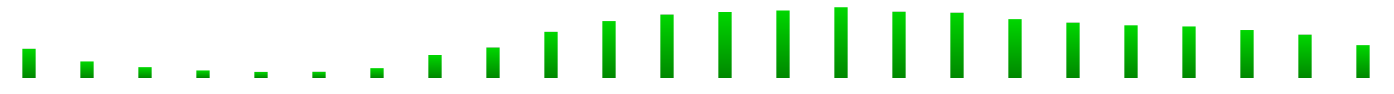
| Category | Series 0 |
|---|---|
| 0 | 299353 |
| 1 | 169805 |
| 2 | 111224 |
| 3 | 77540 |
| 4 | 62429 |
| 5 | 63512 |
| 6 | 100918 |
| 7 | 235971 |
| 8 | 312132 |
| 9 | 473377 |
| 10 | 583693 |
| 11 | 650069 |
| 12 | 677840 |
| 13 | 693407 |
| 14 | 726834 |
| 15 | 680317 |
| 16 | 667971 |
| 17 | 603647 |
| 18 | 567243 |
| 19 | 540410 |
| 20 | 528710 |
| 21 | 492008 |
| 22 | 444161 |
| 23 | 336967 |